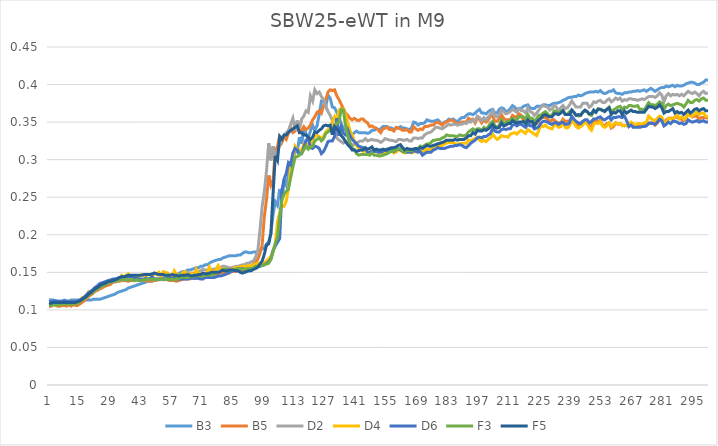
| Category | B3 | B5 | D2 | D4 | D6 | F3 | F5 |
|---|---|---|---|---|---|---|---|
| 0 | 0.114 | 0.104 | 0.11 | 0.107 | 0.111 | 0.106 | 0.109 |
| 1 | 0.113 | 0.105 | 0.109 | 0.108 | 0.111 | 0.106 | 0.109 |
| 2 | 0.113 | 0.107 | 0.11 | 0.109 | 0.112 | 0.107 | 0.11 |
| 3 | 0.112 | 0.106 | 0.11 | 0.109 | 0.112 | 0.107 | 0.11 |
| 4 | 0.112 | 0.105 | 0.11 | 0.11 | 0.111 | 0.107 | 0.11 |
| 5 | 0.112 | 0.105 | 0.109 | 0.109 | 0.111 | 0.107 | 0.11 |
| 6 | 0.112 | 0.106 | 0.11 | 0.108 | 0.111 | 0.108 | 0.11 |
| 7 | 0.113 | 0.106 | 0.11 | 0.109 | 0.112 | 0.108 | 0.11 |
| 8 | 0.112 | 0.105 | 0.111 | 0.109 | 0.111 | 0.108 | 0.11 |
| 9 | 0.112 | 0.107 | 0.111 | 0.109 | 0.111 | 0.108 | 0.11 |
| 10 | 0.113 | 0.105 | 0.11 | 0.109 | 0.111 | 0.108 | 0.11 |
| 11 | 0.113 | 0.107 | 0.11 | 0.109 | 0.111 | 0.108 | 0.11 |
| 12 | 0.113 | 0.106 | 0.111 | 0.109 | 0.111 | 0.108 | 0.11 |
| 13 | 0.113 | 0.106 | 0.111 | 0.11 | 0.111 | 0.109 | 0.111 |
| 14 | 0.113 | 0.108 | 0.112 | 0.111 | 0.113 | 0.111 | 0.112 |
| 15 | 0.113 | 0.11 | 0.115 | 0.116 | 0.115 | 0.113 | 0.114 |
| 16 | 0.113 | 0.112 | 0.116 | 0.115 | 0.117 | 0.115 | 0.116 |
| 17 | 0.113 | 0.115 | 0.118 | 0.118 | 0.12 | 0.117 | 0.118 |
| 18 | 0.113 | 0.118 | 0.121 | 0.124 | 0.123 | 0.12 | 0.121 |
| 19 | 0.113 | 0.12 | 0.123 | 0.123 | 0.125 | 0.122 | 0.123 |
| 20 | 0.114 | 0.122 | 0.125 | 0.126 | 0.127 | 0.124 | 0.126 |
| 21 | 0.114 | 0.125 | 0.127 | 0.128 | 0.13 | 0.126 | 0.128 |
| 22 | 0.114 | 0.126 | 0.128 | 0.13 | 0.132 | 0.128 | 0.13 |
| 23 | 0.114 | 0.128 | 0.13 | 0.132 | 0.135 | 0.13 | 0.132 |
| 24 | 0.115 | 0.129 | 0.132 | 0.134 | 0.136 | 0.132 | 0.134 |
| 25 | 0.116 | 0.131 | 0.133 | 0.134 | 0.137 | 0.133 | 0.135 |
| 26 | 0.117 | 0.132 | 0.135 | 0.135 | 0.138 | 0.134 | 0.136 |
| 27 | 0.118 | 0.133 | 0.136 | 0.139 | 0.139 | 0.136 | 0.138 |
| 28 | 0.119 | 0.134 | 0.137 | 0.138 | 0.14 | 0.137 | 0.138 |
| 29 | 0.12 | 0.137 | 0.137 | 0.139 | 0.141 | 0.138 | 0.139 |
| 30 | 0.121 | 0.137 | 0.138 | 0.14 | 0.141 | 0.138 | 0.14 |
| 31 | 0.123 | 0.138 | 0.139 | 0.14 | 0.142 | 0.139 | 0.141 |
| 32 | 0.124 | 0.138 | 0.14 | 0.141 | 0.143 | 0.14 | 0.143 |
| 33 | 0.125 | 0.139 | 0.14 | 0.146 | 0.144 | 0.141 | 0.144 |
| 34 | 0.126 | 0.139 | 0.14 | 0.143 | 0.144 | 0.14 | 0.144 |
| 35 | 0.127 | 0.139 | 0.14 | 0.146 | 0.144 | 0.14 | 0.145 |
| 36 | 0.129 | 0.138 | 0.14 | 0.148 | 0.144 | 0.14 | 0.146 |
| 37 | 0.13 | 0.139 | 0.141 | 0.143 | 0.144 | 0.14 | 0.146 |
| 38 | 0.131 | 0.139 | 0.14 | 0.145 | 0.144 | 0.14 | 0.146 |
| 39 | 0.132 | 0.14 | 0.14 | 0.146 | 0.142 | 0.139 | 0.146 |
| 40 | 0.133 | 0.14 | 0.14 | 0.142 | 0.142 | 0.14 | 0.146 |
| 41 | 0.134 | 0.139 | 0.139 | 0.145 | 0.141 | 0.139 | 0.146 |
| 42 | 0.135 | 0.14 | 0.14 | 0.147 | 0.141 | 0.139 | 0.146 |
| 43 | 0.136 | 0.139 | 0.14 | 0.146 | 0.141 | 0.14 | 0.147 |
| 44 | 0.137 | 0.139 | 0.141 | 0.144 | 0.142 | 0.14 | 0.147 |
| 45 | 0.138 | 0.138 | 0.14 | 0.147 | 0.141 | 0.141 | 0.147 |
| 46 | 0.138 | 0.138 | 0.14 | 0.147 | 0.142 | 0.14 | 0.147 |
| 47 | 0.138 | 0.139 | 0.141 | 0.144 | 0.144 | 0.141 | 0.148 |
| 48 | 0.14 | 0.139 | 0.141 | 0.149 | 0.141 | 0.141 | 0.149 |
| 49 | 0.14 | 0.14 | 0.142 | 0.147 | 0.14 | 0.14 | 0.148 |
| 50 | 0.141 | 0.14 | 0.142 | 0.15 | 0.141 | 0.141 | 0.147 |
| 51 | 0.142 | 0.142 | 0.142 | 0.145 | 0.141 | 0.141 | 0.147 |
| 52 | 0.142 | 0.141 | 0.143 | 0.151 | 0.141 | 0.14 | 0.147 |
| 53 | 0.143 | 0.141 | 0.143 | 0.15 | 0.141 | 0.141 | 0.146 |
| 54 | 0.145 | 0.14 | 0.143 | 0.149 | 0.142 | 0.141 | 0.146 |
| 55 | 0.145 | 0.139 | 0.143 | 0.146 | 0.142 | 0.14 | 0.146 |
| 56 | 0.145 | 0.139 | 0.144 | 0.144 | 0.142 | 0.141 | 0.147 |
| 57 | 0.147 | 0.139 | 0.144 | 0.152 | 0.142 | 0.14 | 0.146 |
| 58 | 0.147 | 0.138 | 0.145 | 0.147 | 0.141 | 0.141 | 0.146 |
| 59 | 0.148 | 0.139 | 0.146 | 0.146 | 0.141 | 0.142 | 0.145 |
| 60 | 0.15 | 0.14 | 0.146 | 0.147 | 0.141 | 0.143 | 0.146 |
| 61 | 0.151 | 0.141 | 0.148 | 0.15 | 0.141 | 0.144 | 0.146 |
| 62 | 0.151 | 0.141 | 0.147 | 0.151 | 0.141 | 0.143 | 0.146 |
| 63 | 0.153 | 0.141 | 0.149 | 0.144 | 0.141 | 0.143 | 0.147 |
| 64 | 0.153 | 0.141 | 0.149 | 0.146 | 0.142 | 0.144 | 0.146 |
| 65 | 0.154 | 0.143 | 0.148 | 0.149 | 0.142 | 0.144 | 0.145 |
| 66 | 0.155 | 0.142 | 0.149 | 0.145 | 0.142 | 0.145 | 0.146 |
| 67 | 0.156 | 0.142 | 0.15 | 0.154 | 0.142 | 0.145 | 0.146 |
| 68 | 0.156 | 0.144 | 0.151 | 0.148 | 0.142 | 0.146 | 0.147 |
| 69 | 0.158 | 0.143 | 0.152 | 0.148 | 0.141 | 0.145 | 0.147 |
| 70 | 0.158 | 0.144 | 0.154 | 0.147 | 0.141 | 0.145 | 0.149 |
| 71 | 0.16 | 0.143 | 0.153 | 0.147 | 0.143 | 0.146 | 0.148 |
| 72 | 0.16 | 0.143 | 0.153 | 0.15 | 0.143 | 0.146 | 0.148 |
| 73 | 0.162 | 0.146 | 0.154 | 0.157 | 0.143 | 0.147 | 0.149 |
| 74 | 0.164 | 0.146 | 0.154 | 0.151 | 0.143 | 0.146 | 0.15 |
| 75 | 0.165 | 0.147 | 0.154 | 0.152 | 0.143 | 0.147 | 0.15 |
| 76 | 0.166 | 0.148 | 0.155 | 0.153 | 0.144 | 0.149 | 0.15 |
| 77 | 0.167 | 0.148 | 0.155 | 0.159 | 0.145 | 0.15 | 0.15 |
| 78 | 0.167 | 0.149 | 0.156 | 0.154 | 0.145 | 0.151 | 0.151 |
| 79 | 0.169 | 0.149 | 0.158 | 0.154 | 0.146 | 0.153 | 0.153 |
| 80 | 0.17 | 0.149 | 0.158 | 0.154 | 0.147 | 0.154 | 0.152 |
| 81 | 0.171 | 0.15 | 0.157 | 0.153 | 0.148 | 0.154 | 0.152 |
| 82 | 0.172 | 0.149 | 0.156 | 0.153 | 0.15 | 0.153 | 0.153 |
| 83 | 0.172 | 0.151 | 0.156 | 0.154 | 0.151 | 0.153 | 0.153 |
| 84 | 0.172 | 0.152 | 0.157 | 0.155 | 0.152 | 0.153 | 0.153 |
| 85 | 0.172 | 0.151 | 0.158 | 0.157 | 0.154 | 0.154 | 0.152 |
| 86 | 0.173 | 0.152 | 0.158 | 0.156 | 0.155 | 0.155 | 0.152 |
| 87 | 0.173 | 0.153 | 0.159 | 0.157 | 0.154 | 0.155 | 0.15 |
| 88 | 0.175 | 0.152 | 0.16 | 0.158 | 0.155 | 0.154 | 0.149 |
| 89 | 0.177 | 0.153 | 0.16 | 0.158 | 0.154 | 0.154 | 0.15 |
| 90 | 0.177 | 0.155 | 0.162 | 0.158 | 0.154 | 0.154 | 0.151 |
| 91 | 0.176 | 0.156 | 0.162 | 0.159 | 0.155 | 0.155 | 0.152 |
| 92 | 0.176 | 0.158 | 0.164 | 0.158 | 0.155 | 0.155 | 0.152 |
| 93 | 0.177 | 0.161 | 0.165 | 0.16 | 0.155 | 0.156 | 0.154 |
| 94 | 0.177 | 0.164 | 0.17 | 0.161 | 0.156 | 0.158 | 0.155 |
| 95 | 0.178 | 0.167 | 0.178 | 0.162 | 0.157 | 0.158 | 0.157 |
| 96 | 0.18 | 0.175 | 0.205 | 0.162 | 0.158 | 0.159 | 0.161 |
| 97 | 0.181 | 0.186 | 0.237 | 0.162 | 0.159 | 0.159 | 0.165 |
| 98 | 0.182 | 0.224 | 0.257 | 0.163 | 0.16 | 0.16 | 0.174 |
| 99 | 0.188 | 0.247 | 0.285 | 0.165 | 0.162 | 0.161 | 0.186 |
| 100 | 0.19 | 0.279 | 0.322 | 0.168 | 0.164 | 0.162 | 0.188 |
| 101 | 0.202 | 0.266 | 0.299 | 0.171 | 0.168 | 0.167 | 0.202 |
| 102 | 0.227 | 0.273 | 0.318 | 0.179 | 0.179 | 0.177 | 0.255 |
| 103 | 0.244 | 0.313 | 0.303 | 0.187 | 0.185 | 0.189 | 0.305 |
| 104 | 0.239 | 0.317 | 0.309 | 0.217 | 0.19 | 0.197 | 0.299 |
| 105 | 0.261 | 0.332 | 0.319 | 0.23 | 0.195 | 0.224 | 0.331 |
| 106 | 0.249 | 0.323 | 0.327 | 0.238 | 0.258 | 0.246 | 0.327 |
| 107 | 0.273 | 0.33 | 0.332 | 0.238 | 0.274 | 0.254 | 0.333 |
| 108 | 0.266 | 0.327 | 0.336 | 0.245 | 0.282 | 0.258 | 0.333 |
| 109 | 0.279 | 0.336 | 0.339 | 0.262 | 0.296 | 0.261 | 0.336 |
| 110 | 0.296 | 0.342 | 0.347 | 0.288 | 0.293 | 0.276 | 0.339 |
| 111 | 0.295 | 0.336 | 0.355 | 0.3 | 0.309 | 0.29 | 0.341 |
| 112 | 0.313 | 0.338 | 0.339 | 0.318 | 0.315 | 0.303 | 0.343 |
| 113 | 0.31 | 0.35 | 0.352 | 0.314 | 0.313 | 0.304 | 0.345 |
| 114 | 0.33 | 0.337 | 0.342 | 0.312 | 0.308 | 0.306 | 0.336 |
| 115 | 0.321 | 0.339 | 0.354 | 0.313 | 0.308 | 0.309 | 0.336 |
| 116 | 0.343 | 0.344 | 0.358 | 0.321 | 0.316 | 0.313 | 0.333 |
| 117 | 0.333 | 0.34 | 0.365 | 0.322 | 0.326 | 0.318 | 0.333 |
| 118 | 0.329 | 0.342 | 0.363 | 0.317 | 0.328 | 0.314 | 0.33 |
| 119 | 0.338 | 0.346 | 0.385 | 0.32 | 0.316 | 0.317 | 0.327 |
| 120 | 0.346 | 0.353 | 0.378 | 0.326 | 0.315 | 0.318 | 0.33 |
| 121 | 0.339 | 0.357 | 0.393 | 0.332 | 0.318 | 0.325 | 0.337 |
| 122 | 0.345 | 0.363 | 0.388 | 0.332 | 0.317 | 0.327 | 0.336 |
| 123 | 0.36 | 0.365 | 0.39 | 0.331 | 0.315 | 0.329 | 0.339 |
| 124 | 0.378 | 0.362 | 0.384 | 0.328 | 0.308 | 0.325 | 0.341 |
| 125 | 0.378 | 0.372 | 0.38 | 0.331 | 0.311 | 0.328 | 0.345 |
| 126 | 0.371 | 0.38 | 0.372 | 0.337 | 0.317 | 0.335 | 0.346 |
| 127 | 0.386 | 0.39 | 0.364 | 0.34 | 0.324 | 0.337 | 0.345 |
| 128 | 0.382 | 0.393 | 0.359 | 0.342 | 0.325 | 0.339 | 0.346 |
| 129 | 0.37 | 0.392 | 0.352 | 0.35 | 0.325 | 0.342 | 0.333 |
| 130 | 0.369 | 0.393 | 0.339 | 0.357 | 0.331 | 0.343 | 0.344 |
| 131 | 0.363 | 0.385 | 0.329 | 0.351 | 0.355 | 0.349 | 0.341 |
| 132 | 0.357 | 0.38 | 0.326 | 0.366 | 0.332 | 0.35 | 0.338 |
| 133 | 0.348 | 0.374 | 0.324 | 0.368 | 0.344 | 0.367 | 0.332 |
| 134 | 0.342 | 0.368 | 0.322 | 0.367 | 0.335 | 0.366 | 0.329 |
| 135 | 0.339 | 0.362 | 0.324 | 0.36 | 0.333 | 0.345 | 0.324 |
| 136 | 0.332 | 0.359 | 0.325 | 0.349 | 0.34 | 0.331 | 0.32 |
| 137 | 0.331 | 0.355 | 0.322 | 0.339 | 0.332 | 0.323 | 0.317 |
| 138 | 0.333 | 0.353 | 0.32 | 0.333 | 0.327 | 0.316 | 0.313 |
| 139 | 0.336 | 0.355 | 0.32 | 0.325 | 0.324 | 0.313 | 0.313 |
| 140 | 0.338 | 0.353 | 0.322 | 0.319 | 0.321 | 0.308 | 0.311 |
| 141 | 0.336 | 0.352 | 0.324 | 0.315 | 0.318 | 0.306 | 0.312 |
| 142 | 0.336 | 0.354 | 0.325 | 0.314 | 0.317 | 0.307 | 0.313 |
| 143 | 0.336 | 0.354 | 0.325 | 0.311 | 0.316 | 0.307 | 0.313 |
| 144 | 0.336 | 0.351 | 0.328 | 0.312 | 0.314 | 0.307 | 0.316 |
| 145 | 0.335 | 0.349 | 0.325 | 0.31 | 0.31 | 0.307 | 0.314 |
| 146 | 0.336 | 0.344 | 0.326 | 0.31 | 0.31 | 0.306 | 0.315 |
| 147 | 0.339 | 0.345 | 0.327 | 0.312 | 0.311 | 0.309 | 0.317 |
| 148 | 0.339 | 0.343 | 0.326 | 0.312 | 0.311 | 0.306 | 0.313 |
| 149 | 0.341 | 0.342 | 0.326 | 0.312 | 0.311 | 0.306 | 0.314 |
| 150 | 0.34 | 0.339 | 0.325 | 0.309 | 0.31 | 0.305 | 0.313 |
| 151 | 0.341 | 0.336 | 0.323 | 0.309 | 0.31 | 0.305 | 0.313 |
| 152 | 0.344 | 0.341 | 0.325 | 0.309 | 0.311 | 0.306 | 0.314 |
| 153 | 0.344 | 0.342 | 0.328 | 0.31 | 0.313 | 0.307 | 0.313 |
| 154 | 0.344 | 0.343 | 0.327 | 0.309 | 0.312 | 0.308 | 0.314 |
| 155 | 0.342 | 0.34 | 0.326 | 0.31 | 0.312 | 0.31 | 0.315 |
| 156 | 0.342 | 0.34 | 0.326 | 0.312 | 0.314 | 0.311 | 0.316 |
| 157 | 0.34 | 0.338 | 0.325 | 0.309 | 0.311 | 0.312 | 0.316 |
| 158 | 0.342 | 0.343 | 0.324 | 0.31 | 0.313 | 0.313 | 0.317 |
| 159 | 0.342 | 0.342 | 0.327 | 0.313 | 0.314 | 0.314 | 0.319 |
| 160 | 0.344 | 0.341 | 0.327 | 0.313 | 0.313 | 0.315 | 0.32 |
| 161 | 0.342 | 0.339 | 0.326 | 0.31 | 0.311 | 0.311 | 0.316 |
| 162 | 0.342 | 0.339 | 0.326 | 0.309 | 0.311 | 0.31 | 0.313 |
| 163 | 0.341 | 0.34 | 0.327 | 0.31 | 0.31 | 0.313 | 0.315 |
| 164 | 0.34 | 0.337 | 0.325 | 0.311 | 0.31 | 0.312 | 0.314 |
| 165 | 0.342 | 0.337 | 0.325 | 0.309 | 0.31 | 0.312 | 0.314 |
| 166 | 0.35 | 0.344 | 0.329 | 0.31 | 0.312 | 0.314 | 0.314 |
| 167 | 0.349 | 0.341 | 0.329 | 0.311 | 0.311 | 0.315 | 0.315 |
| 168 | 0.346 | 0.339 | 0.328 | 0.31 | 0.31 | 0.315 | 0.314 |
| 169 | 0.348 | 0.341 | 0.329 | 0.311 | 0.311 | 0.318 | 0.316 |
| 170 | 0.348 | 0.34 | 0.329 | 0.31 | 0.306 | 0.317 | 0.315 |
| 171 | 0.349 | 0.344 | 0.333 | 0.312 | 0.308 | 0.319 | 0.317 |
| 172 | 0.353 | 0.344 | 0.335 | 0.314 | 0.31 | 0.321 | 0.319 |
| 173 | 0.352 | 0.345 | 0.336 | 0.313 | 0.31 | 0.321 | 0.318 |
| 174 | 0.351 | 0.346 | 0.337 | 0.314 | 0.31 | 0.323 | 0.318 |
| 175 | 0.351 | 0.346 | 0.34 | 0.316 | 0.313 | 0.326 | 0.319 |
| 176 | 0.352 | 0.349 | 0.343 | 0.318 | 0.314 | 0.326 | 0.32 |
| 177 | 0.353 | 0.35 | 0.343 | 0.319 | 0.316 | 0.327 | 0.321 |
| 178 | 0.35 | 0.348 | 0.342 | 0.319 | 0.315 | 0.327 | 0.322 |
| 179 | 0.347 | 0.346 | 0.341 | 0.319 | 0.315 | 0.329 | 0.323 |
| 180 | 0.35 | 0.349 | 0.343 | 0.321 | 0.315 | 0.33 | 0.324 |
| 181 | 0.351 | 0.35 | 0.345 | 0.322 | 0.316 | 0.333 | 0.326 |
| 182 | 0.354 | 0.352 | 0.347 | 0.323 | 0.317 | 0.332 | 0.326 |
| 183 | 0.353 | 0.353 | 0.346 | 0.323 | 0.318 | 0.332 | 0.326 |
| 184 | 0.354 | 0.352 | 0.347 | 0.323 | 0.318 | 0.332 | 0.326 |
| 185 | 0.352 | 0.349 | 0.347 | 0.321 | 0.319 | 0.331 | 0.327 |
| 186 | 0.35 | 0.347 | 0.346 | 0.321 | 0.319 | 0.331 | 0.326 |
| 187 | 0.354 | 0.349 | 0.347 | 0.321 | 0.32 | 0.333 | 0.327 |
| 188 | 0.356 | 0.35 | 0.347 | 0.322 | 0.319 | 0.332 | 0.327 |
| 189 | 0.356 | 0.35 | 0.349 | 0.322 | 0.317 | 0.332 | 0.327 |
| 190 | 0.359 | 0.35 | 0.348 | 0.322 | 0.316 | 0.333 | 0.329 |
| 191 | 0.361 | 0.355 | 0.351 | 0.326 | 0.319 | 0.337 | 0.332 |
| 192 | 0.361 | 0.353 | 0.35 | 0.325 | 0.322 | 0.339 | 0.332 |
| 193 | 0.36 | 0.354 | 0.353 | 0.327 | 0.324 | 0.341 | 0.336 |
| 194 | 0.362 | 0.349 | 0.351 | 0.328 | 0.326 | 0.339 | 0.334 |
| 195 | 0.365 | 0.355 | 0.358 | 0.33 | 0.329 | 0.341 | 0.339 |
| 196 | 0.367 | 0.354 | 0.356 | 0.326 | 0.33 | 0.341 | 0.338 |
| 197 | 0.362 | 0.349 | 0.352 | 0.324 | 0.329 | 0.339 | 0.338 |
| 198 | 0.362 | 0.353 | 0.356 | 0.326 | 0.331 | 0.343 | 0.34 |
| 199 | 0.361 | 0.35 | 0.353 | 0.324 | 0.331 | 0.341 | 0.339 |
| 200 | 0.364 | 0.353 | 0.357 | 0.327 | 0.333 | 0.344 | 0.341 |
| 201 | 0.366 | 0.358 | 0.36 | 0.329 | 0.335 | 0.349 | 0.344 |
| 202 | 0.367 | 0.358 | 0.365 | 0.334 | 0.342 | 0.351 | 0.347 |
| 203 | 0.362 | 0.351 | 0.358 | 0.33 | 0.338 | 0.345 | 0.343 |
| 204 | 0.362 | 0.351 | 0.357 | 0.327 | 0.337 | 0.343 | 0.342 |
| 205 | 0.367 | 0.355 | 0.36 | 0.329 | 0.337 | 0.346 | 0.343 |
| 206 | 0.369 | 0.36 | 0.366 | 0.332 | 0.34 | 0.353 | 0.349 |
| 207 | 0.368 | 0.355 | 0.364 | 0.331 | 0.341 | 0.349 | 0.345 |
| 208 | 0.364 | 0.353 | 0.361 | 0.331 | 0.34 | 0.349 | 0.346 |
| 209 | 0.365 | 0.353 | 0.362 | 0.33 | 0.341 | 0.351 | 0.348 |
| 210 | 0.368 | 0.353 | 0.364 | 0.334 | 0.341 | 0.352 | 0.348 |
| 211 | 0.372 | 0.359 | 0.367 | 0.335 | 0.346 | 0.355 | 0.352 |
| 212 | 0.37 | 0.357 | 0.365 | 0.336 | 0.347 | 0.353 | 0.35 |
| 213 | 0.367 | 0.357 | 0.363 | 0.334 | 0.345 | 0.353 | 0.349 |
| 214 | 0.368 | 0.361 | 0.368 | 0.337 | 0.347 | 0.357 | 0.35 |
| 215 | 0.368 | 0.359 | 0.365 | 0.339 | 0.347 | 0.357 | 0.35 |
| 216 | 0.371 | 0.352 | 0.365 | 0.337 | 0.345 | 0.357 | 0.351 |
| 217 | 0.372 | 0.351 | 0.362 | 0.335 | 0.343 | 0.354 | 0.348 |
| 218 | 0.373 | 0.354 | 0.369 | 0.34 | 0.347 | 0.36 | 0.353 |
| 219 | 0.369 | 0.35 | 0.364 | 0.338 | 0.345 | 0.355 | 0.35 |
| 220 | 0.368 | 0.351 | 0.363 | 0.336 | 0.345 | 0.355 | 0.351 |
| 221 | 0.368 | 0.347 | 0.359 | 0.334 | 0.341 | 0.35 | 0.345 |
| 222 | 0.371 | 0.348 | 0.362 | 0.332 | 0.342 | 0.355 | 0.35 |
| 223 | 0.371 | 0.352 | 0.366 | 0.339 | 0.344 | 0.359 | 0.353 |
| 224 | 0.371 | 0.358 | 0.37 | 0.346 | 0.349 | 0.359 | 0.355 |
| 225 | 0.373 | 0.356 | 0.372 | 0.344 | 0.351 | 0.362 | 0.359 |
| 226 | 0.373 | 0.356 | 0.371 | 0.346 | 0.351 | 0.364 | 0.36 |
| 227 | 0.372 | 0.354 | 0.37 | 0.343 | 0.35 | 0.361 | 0.358 |
| 228 | 0.372 | 0.35 | 0.366 | 0.342 | 0.348 | 0.358 | 0.357 |
| 229 | 0.374 | 0.353 | 0.368 | 0.341 | 0.347 | 0.359 | 0.357 |
| 230 | 0.375 | 0.353 | 0.372 | 0.346 | 0.349 | 0.365 | 0.361 |
| 231 | 0.375 | 0.35 | 0.37 | 0.346 | 0.349 | 0.364 | 0.361 |
| 232 | 0.376 | 0.349 | 0.365 | 0.343 | 0.347 | 0.361 | 0.36 |
| 233 | 0.377 | 0.349 | 0.369 | 0.344 | 0.349 | 0.364 | 0.362 |
| 234 | 0.379 | 0.354 | 0.372 | 0.35 | 0.35 | 0.366 | 0.365 |
| 235 | 0.38 | 0.351 | 0.368 | 0.343 | 0.347 | 0.361 | 0.36 |
| 236 | 0.382 | 0.351 | 0.369 | 0.342 | 0.347 | 0.36 | 0.36 |
| 237 | 0.383 | 0.352 | 0.373 | 0.345 | 0.349 | 0.364 | 0.36 |
| 238 | 0.383 | 0.355 | 0.378 | 0.353 | 0.358 | 0.366 | 0.366 |
| 239 | 0.384 | 0.35 | 0.374 | 0.349 | 0.354 | 0.363 | 0.363 |
| 240 | 0.384 | 0.347 | 0.37 | 0.344 | 0.351 | 0.359 | 0.359 |
| 241 | 0.386 | 0.345 | 0.37 | 0.342 | 0.349 | 0.358 | 0.36 |
| 242 | 0.385 | 0.347 | 0.37 | 0.344 | 0.348 | 0.359 | 0.359 |
| 243 | 0.386 | 0.35 | 0.375 | 0.346 | 0.351 | 0.363 | 0.363 |
| 244 | 0.388 | 0.351 | 0.375 | 0.35 | 0.353 | 0.365 | 0.366 |
| 245 | 0.389 | 0.351 | 0.375 | 0.348 | 0.353 | 0.364 | 0.364 |
| 246 | 0.39 | 0.344 | 0.37 | 0.342 | 0.349 | 0.36 | 0.361 |
| 247 | 0.39 | 0.344 | 0.372 | 0.339 | 0.351 | 0.359 | 0.361 |
| 248 | 0.39 | 0.353 | 0.377 | 0.347 | 0.354 | 0.364 | 0.366 |
| 249 | 0.391 | 0.351 | 0.376 | 0.349 | 0.354 | 0.364 | 0.363 |
| 250 | 0.39 | 0.35 | 0.378 | 0.348 | 0.356 | 0.368 | 0.367 |
| 251 | 0.392 | 0.353 | 0.379 | 0.351 | 0.357 | 0.367 | 0.367 |
| 252 | 0.389 | 0.346 | 0.376 | 0.345 | 0.354 | 0.365 | 0.366 |
| 253 | 0.388 | 0.345 | 0.376 | 0.343 | 0.353 | 0.365 | 0.364 |
| 254 | 0.389 | 0.348 | 0.379 | 0.345 | 0.355 | 0.367 | 0.367 |
| 255 | 0.391 | 0.349 | 0.381 | 0.349 | 0.357 | 0.37 | 0.369 |
| 256 | 0.391 | 0.342 | 0.377 | 0.344 | 0.353 | 0.364 | 0.36 |
| 257 | 0.393 | 0.344 | 0.379 | 0.347 | 0.356 | 0.366 | 0.363 |
| 258 | 0.389 | 0.349 | 0.382 | 0.349 | 0.356 | 0.368 | 0.362 |
| 259 | 0.388 | 0.347 | 0.38 | 0.348 | 0.357 | 0.37 | 0.365 |
| 260 | 0.388 | 0.348 | 0.382 | 0.348 | 0.357 | 0.371 | 0.365 |
| 261 | 0.387 | 0.346 | 0.378 | 0.345 | 0.356 | 0.367 | 0.36 |
| 262 | 0.389 | 0.345 | 0.38 | 0.346 | 0.358 | 0.37 | 0.365 |
| 263 | 0.389 | 0.346 | 0.379 | 0.345 | 0.352 | 0.369 | 0.362 |
| 264 | 0.39 | 0.348 | 0.381 | 0.348 | 0.344 | 0.372 | 0.364 |
| 265 | 0.39 | 0.348 | 0.381 | 0.35 | 0.346 | 0.372 | 0.366 |
| 266 | 0.391 | 0.348 | 0.38 | 0.347 | 0.343 | 0.371 | 0.364 |
| 267 | 0.391 | 0.345 | 0.38 | 0.346 | 0.343 | 0.371 | 0.364 |
| 268 | 0.392 | 0.346 | 0.379 | 0.348 | 0.343 | 0.372 | 0.363 |
| 269 | 0.391 | 0.345 | 0.38 | 0.348 | 0.343 | 0.367 | 0.363 |
| 270 | 0.392 | 0.347 | 0.381 | 0.347 | 0.344 | 0.367 | 0.363 |
| 271 | 0.393 | 0.345 | 0.38 | 0.349 | 0.344 | 0.366 | 0.363 |
| 272 | 0.391 | 0.347 | 0.382 | 0.35 | 0.345 | 0.371 | 0.367 |
| 273 | 0.393 | 0.349 | 0.384 | 0.358 | 0.348 | 0.376 | 0.371 |
| 274 | 0.395 | 0.348 | 0.384 | 0.355 | 0.349 | 0.373 | 0.37 |
| 275 | 0.393 | 0.349 | 0.384 | 0.353 | 0.348 | 0.373 | 0.37 |
| 276 | 0.391 | 0.346 | 0.383 | 0.352 | 0.347 | 0.372 | 0.368 |
| 277 | 0.393 | 0.349 | 0.385 | 0.355 | 0.35 | 0.374 | 0.37 |
| 278 | 0.395 | 0.353 | 0.389 | 0.358 | 0.354 | 0.377 | 0.373 |
| 279 | 0.396 | 0.353 | 0.386 | 0.357 | 0.352 | 0.375 | 0.369 |
| 280 | 0.396 | 0.347 | 0.377 | 0.348 | 0.345 | 0.367 | 0.362 |
| 281 | 0.398 | 0.353 | 0.385 | 0.35 | 0.347 | 0.372 | 0.364 |
| 282 | 0.397 | 0.355 | 0.388 | 0.355 | 0.35 | 0.374 | 0.364 |
| 283 | 0.398 | 0.355 | 0.385 | 0.354 | 0.348 | 0.372 | 0.366 |
| 284 | 0.399 | 0.355 | 0.387 | 0.354 | 0.351 | 0.373 | 0.368 |
| 285 | 0.397 | 0.356 | 0.386 | 0.357 | 0.351 | 0.374 | 0.362 |
| 286 | 0.399 | 0.357 | 0.387 | 0.359 | 0.35 | 0.375 | 0.364 |
| 287 | 0.398 | 0.354 | 0.385 | 0.355 | 0.348 | 0.374 | 0.362 |
| 288 | 0.398 | 0.354 | 0.387 | 0.357 | 0.349 | 0.373 | 0.363 |
| 289 | 0.399 | 0.352 | 0.385 | 0.354 | 0.347 | 0.37 | 0.36 |
| 290 | 0.401 | 0.355 | 0.388 | 0.355 | 0.348 | 0.374 | 0.363 |
| 291 | 0.402 | 0.361 | 0.391 | 0.362 | 0.353 | 0.379 | 0.366 |
| 292 | 0.403 | 0.359 | 0.389 | 0.358 | 0.351 | 0.376 | 0.362 |
| 293 | 0.403 | 0.357 | 0.388 | 0.358 | 0.35 | 0.376 | 0.364 |
| 294 | 0.402 | 0.358 | 0.39 | 0.361 | 0.351 | 0.379 | 0.367 |
| 295 | 0.4 | 0.358 | 0.388 | 0.364 | 0.352 | 0.38 | 0.368 |
| 296 | 0.4 | 0.354 | 0.385 | 0.36 | 0.35 | 0.378 | 0.365 |
| 297 | 0.402 | 0.356 | 0.389 | 0.362 | 0.351 | 0.381 | 0.367 |
| 298 | 0.403 | 0.356 | 0.391 | 0.362 | 0.352 | 0.382 | 0.368 |
| 299 | 0.406 | 0.356 | 0.388 | 0.358 | 0.35 | 0.379 | 0.365 |
| 300 | 0.406 | 0.355 | 0.389 | 0.357 | 0.35 | 0.379 | 0.365 |